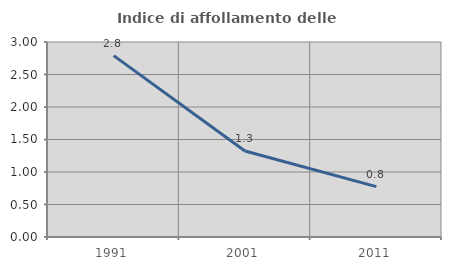
| Category | Indice di affollamento delle abitazioni  |
|---|---|
| 1991.0 | 2.791 |
| 2001.0 | 1.324 |
| 2011.0 | 0.774 |